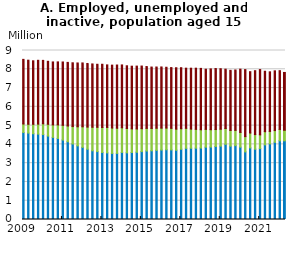
| Category | Employed | Unemployed | Inactive |
|---|---|---|---|
| 2009-03-01 | 4.582 | 0.455 | 3.437 |
| 2009-06-01 | 4.552 | 0.471 | 3.407 |
| 2009-09-01 | 4.517 | 0.503 | 3.379 |
| 2009-12-01 | 4.499 | 0.532 | 3.394 |
| 2010-03-01 | 4.472 | 0.577 | 3.372 |
| 2010-06-01 | 4.393 | 0.628 | 3.351 |
| 2010-09-01 | 4.32 | 0.668 | 3.35 |
| 2010-12-01 | 4.265 | 0.723 | 3.352 |
| 2011-03-01 | 4.183 | 0.781 | 3.372 |
| 2011-06-01 | 4.089 | 0.84 | 3.384 |
| 2011-09-01 | 3.974 | 0.922 | 3.397 |
| 2011-12-01 | 3.871 | 1.016 | 3.397 |
| 2012-03-01 | 3.789 | 1.097 | 3.399 |
| 2012-06-01 | 3.687 | 1.183 | 3.386 |
| 2012-09-01 | 3.608 | 1.254 | 3.37 |
| 2012-12-01 | 3.563 | 1.296 | 3.354 |
| 2013-03-01 | 3.514 | 1.332 | 3.368 |
| 2013-06-01 | 3.498 | 1.353 | 3.33 |
| 2013-09-01 | 3.469 | 1.353 | 3.345 |
| 2013-12-01 | 3.471 | 1.34 | 3.363 |
| 2014-03-01 | 3.52 | 1.314 | 3.344 |
| 2014-06-01 | 3.5 | 1.294 | 3.339 |
| 2014-09-01 | 3.514 | 1.261 | 3.336 |
| 2014-12-01 | 3.532 | 1.24 | 3.344 |
| 2015-03-01 | 3.562 | 1.225 | 3.333 |
| 2015-06-01 | 3.6 | 1.2 | 3.293 |
| 2015-09-01 | 3.608 | 1.19 | 3.268 |
| 2015-12-01 | 3.632 | 1.176 | 3.259 |
| 2016-03-01 | 3.65 | 1.165 | 3.256 |
| 2016-06-01 | 3.664 | 1.154 | 3.236 |
| 2016-09-01 | 3.655 | 1.148 | 3.234 |
| 2016-12-01 | 3.641 | 1.121 | 3.267 |
| 2017-03-01 | 3.693 | 1.092 | 3.245 |
| 2017-06-01 | 3.742 | 1.06 | 3.204 |
| 2017-09-01 | 3.747 | 1.018 | 3.24 |
| 2017-12-01 | 3.749 | 0.999 | 3.257 |
| 2018-03-01 | 3.758 | 0.971 | 3.265 |
| 2018-06-01 | 3.802 | 0.946 | 3.204 |
| 2018-09-01 | 3.81 | 0.922 | 3.236 |
| 2018-12-01 | 3.837 | 0.901 | 3.248 |
| 2019-03-01 | 3.858 | 0.899 | 3.219 |
| 2019-06-01 | 3.952 | 0.842 | 3.159 |
| 2019-09-01 | 3.855 | 0.837 | 3.198 |
| 2019-12-01 | 3.882 | 0.813 | 3.214 |
| 2020-03-01 | 3.803 | 0.781 | 3.367 |
| 2020-06-01 | 3.55 | 0.812 | 3.568 |
| 2020-09-01 | 3.763 | 0.794 | 3.262 |
| 2020-12-01 | 3.693 | 0.775 | 3.403 |
| 2021-03-01 | 3.726 | 0.732 | 3.474 |
| 2021-06-01 | 3.925 | 0.701 | 3.215 |
| 2021-09-01 | 3.979 | 0.659 | 3.174 |
| 2021-12-01 | 4.062 | 0.62 | 3.183 |
| 2022-03-01 | 4.139 | 0.606 | 3.128 |
| 2022-06-01 | 4.137 | 0.563 | 3.078 |